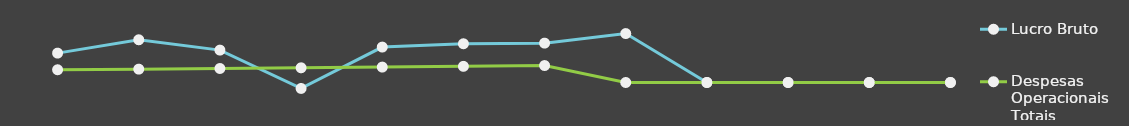
| Category | Lucro Bruto | Despesas Operacionais Totais |
|---|---|---|
| 0 | 25000 | 10841 |
| 1 | 36348 | 11367.25 |
| 2 | 27562 | 11919.82 |
| 3 | -5059.5 | 12500.01 |
| 4 | 30153.18 | 13109.21 |
| 5 | 32964.45 | 13748.86 |
| 6 | 33502.87 | 14420.51 |
| 7 | 41646 | 0 |
| 8 | 0 | 0 |
| 9 | 0 | 0 |
| 10 | 0 | 0 |
| 11 | 0 | 0 |